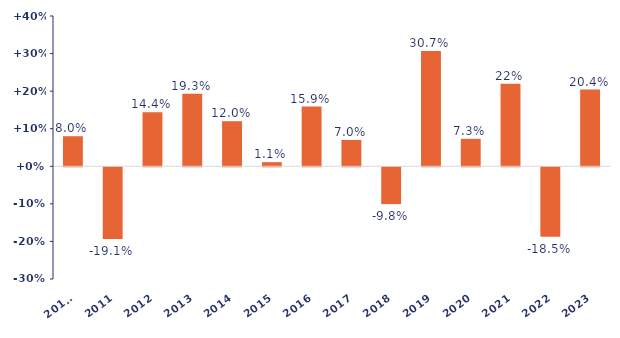
| Category | Series 0 |
|---|---|
| 2010* | 0.08 |
| 2011 | -0.191 |
| 2012 | 0.144 |
| 2013 | 0.193 |
| 2014 | 0.12 |
| 2015 | 0.011 |
| 2016 | 0.159 |
| 2017 | 0.07 |
| 2018 | -0.098 |
| 2019 | 0.307 |
| 2020 | 0.073 |
| 2021 | 0.22 |
| 2022 | -0.185 |
| 2023 | 0.204 |